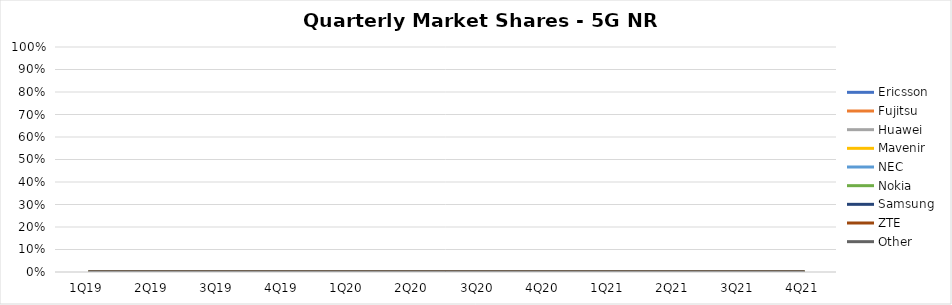
| Category | Ericsson | Fujitsu | Huawei | Mavenir | NEC | Nokia | Samsung | ZTE | Other |
|---|---|---|---|---|---|---|---|---|---|
| 1Q19 | 0 | 0 | 0 | 0 | 0 | 0 | 0 | 0 | 0 |
| 2Q19 | 0 | 0 | 0 | 0 | 0 | 0 | 0 | 0 | 0 |
| 3Q19 | 0 | 0 | 0 | 0 | 0 | 0 | 0 | 0 | 0 |
| 4Q19 | 0 | 0 | 0 | 0 | 0 | 0 | 0 | 0 | 0 |
| 1Q20 | 0 | 0 | 0 | 0 | 0 | 0 | 0 | 0 | 0 |
| 2Q20 | 0 | 0 | 0 | 0 | 0 | 0 | 0 | 0 | 0 |
| 3Q20 | 0 | 0 | 0 | 0 | 0 | 0 | 0 | 0 | 0 |
| 4Q20 | 0 | 0 | 0 | 0 | 0 | 0 | 0 | 0 | 0 |
| 1Q21 | 0 | 0 | 0 | 0 | 0 | 0 | 0 | 0 | 0 |
| 2Q21 | 0 | 0 | 0 | 0 | 0 | 0 | 0 | 0 | 0 |
| 3Q21 | 0 | 0 | 0 | 0 | 0 | 0 | 0 | 0 | 0 |
| 4Q21 | 0 | 0 | 0 | 0 | 0 | 0 | 0 | 0 | 0 |